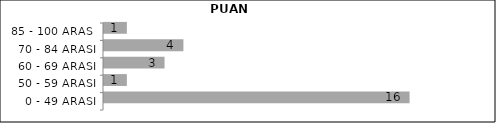
| Category | Series 0 | Series 1 | Series 2 |
|---|---|---|---|
| 0 - 49 ARASI |  |  | 16 |
| 50 - 59 ARASI |  |  | 1 |
| 60 - 69 ARASI |  |  | 3 |
| 70 - 84 ARASI |  |  | 4 |
| 85 - 100 ARASI |  |  | 1 |